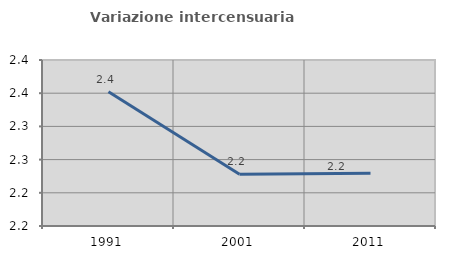
| Category | Variazione intercensuaria annua |
|---|---|
| 1991.0 | 2.352 |
| 2001.0 | 2.228 |
| 2011.0 | 2.229 |